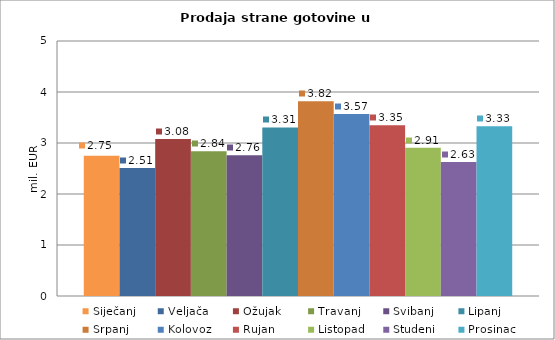
| Category | Siječanj | Veljača | Ožujak | Travanj | Svibanj | Lipanj | Srpanj | Kolovoz | Rujan | Listopad | Studeni | Prosinac |
|---|---|---|---|---|---|---|---|---|---|---|---|---|
| 0 | 2.748 | 2.511 | 3.077 | 2.839 | 2.759 | 3.306 | 3.818 | 3.568 | 3.346 | 2.909 | 2.63 | 3.327 |